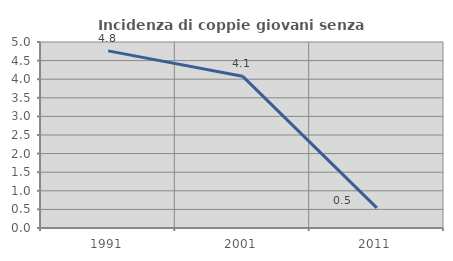
| Category | Incidenza di coppie giovani senza figli |
|---|---|
| 1991.0 | 4.762 |
| 2001.0 | 4.082 |
| 2011.0 | 0.541 |